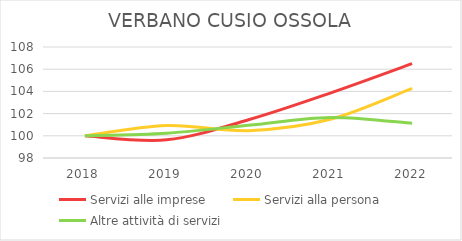
| Category | Servizi alle imprese | Servizi alla persona | Altre attività di servizi |
|---|---|---|---|
| 2018.0 | 100 | 100 | 100 |
| 2019.0 | 99.639 | 100.928 | 100.237 |
| 2020.0 | 101.444 | 100.464 | 100.946 |
| 2021.0 | 103.851 | 101.484 | 101.656 |
| 2022.0 | 106.498 | 104.267 | 101.124 |